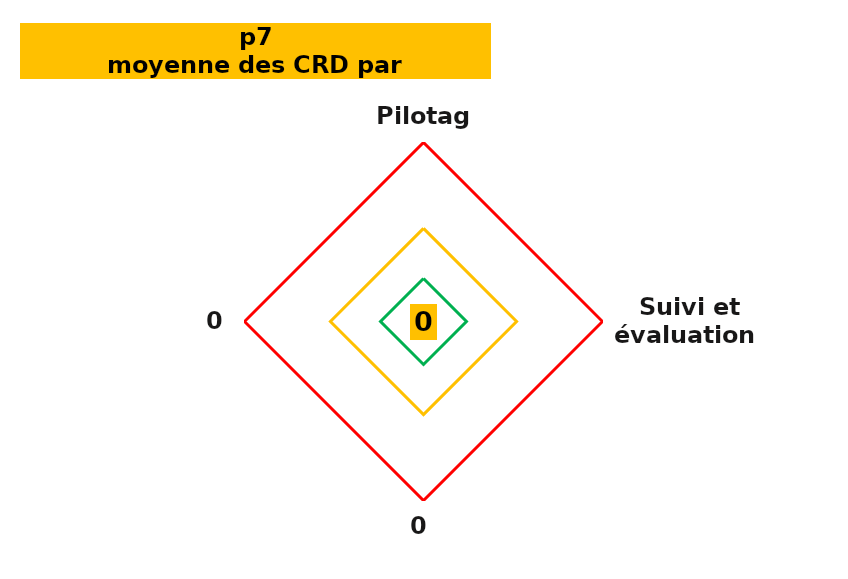
| Category | Series 0 | Series 1 | Series 2 | Series 3 |
|---|---|---|---|---|
| Pilotage | 0 | 6 | 13 | 25 |
| Suivi et évaluation   | 0 | 6 | 13 | 25 |
| 0 | 0 | 6 | 13 | 25 |
| 0 | 0 | 6 | 13 | 25 |